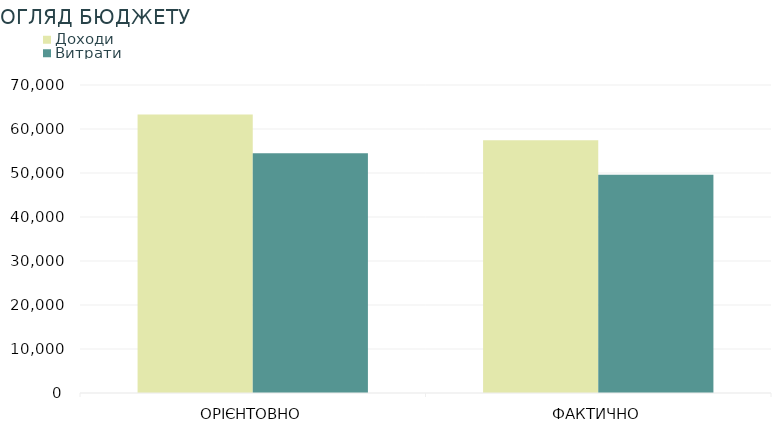
| Category | Доходи | Витрати |
|---|---|---|
| ОРІЄНТОВНО | 63300 | 54500 |
| ФАКТИЧНО | 57450 | 49630 |